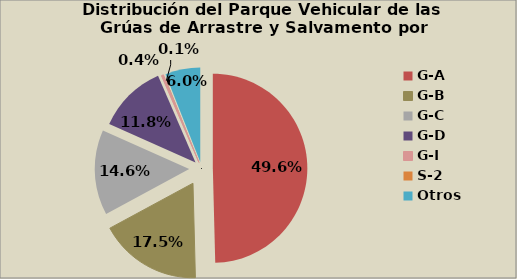
| Category | Series 0 |
|---|---|
| G-A | 49.622 |
| G-B | 17.525 |
| G-C | 14.572 |
| G-D | 11.841 |
| G-I | 0.361 |
| S-2 | 0.112 |
| S-3 | 0.026 |
| Otros | 6 |